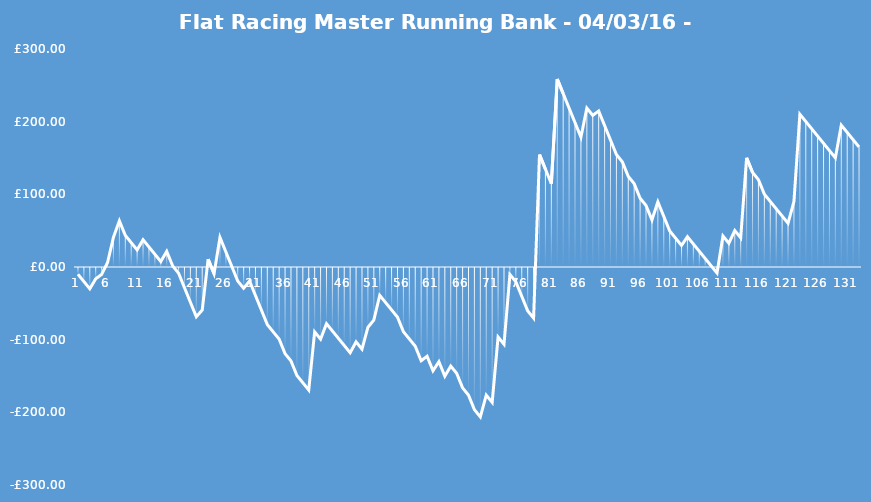
| Category | Running Bank |
|---|---|
| 0 | -10 |
| 1 | -20 |
| 2 | -30 |
| 3 | -16.233 |
| 4 | -10.233 |
| 5 | 6.033 |
| 6 | 41.033 |
| 7 | 63.533 |
| 8 | 43.533 |
| 9 | 33.533 |
| 10 | 23.533 |
| 11 | 37.533 |
| 12 | 27.533 |
| 13 | 17.533 |
| 14 | 7.533 |
| 15 | 21.533 |
| 16 | 1.533 |
| 17 | -8.467 |
| 18 | -28.467 |
| 19 | -48.467 |
| 20 | -68.467 |
| 21 | -59.267 |
| 22 | 10.733 |
| 23 | -9.267 |
| 24 | 40.733 |
| 25 | 20.733 |
| 26 | 0.733 |
| 27 | -19.267 |
| 28 | -29.267 |
| 29 | -19.267 |
| 30 | -39.267 |
| 31 | -59.267 |
| 32 | -79.267 |
| 33 | -89.267 |
| 34 | -99.267 |
| 35 | -119.267 |
| 36 | -129.267 |
| 37 | -149.267 |
| 38 | -159.267 |
| 39 | -169.267 |
| 40 | -89.267 |
| 41 | -99.267 |
| 42 | -78.017 |
| 43 | -88.017 |
| 44 | -98.017 |
| 45 | -108.017 |
| 46 | -118.017 |
| 47 | -103.017 |
| 48 | -113.017 |
| 49 | -83.017 |
| 50 | -73.017 |
| 51 | -39.017 |
| 52 | -49.017 |
| 53 | -59.017 |
| 54 | -69.017 |
| 55 | -89.017 |
| 56 | -99.017 |
| 57 | -109.017 |
| 58 | -129.017 |
| 59 | -122.817 |
| 60 | -142.817 |
| 61 | -130.317 |
| 62 | -150.317 |
| 63 | -136.317 |
| 64 | -146.317 |
| 65 | -166.317 |
| 66 | -176.317 |
| 67 | -196.317 |
| 68 | -206.317 |
| 69 | -176.317 |
| 70 | -186.317 |
| 71 | -96.317 |
| 72 | -106.317 |
| 73 | -10.317 |
| 74 | -20.317 |
| 75 | -40.317 |
| 76 | -60.317 |
| 77 | -70.317 |
| 78 | 154.683 |
| 79 | 134.683 |
| 80 | 114.683 |
| 81 | 258.683 |
| 82 | 238.683 |
| 83 | 218.683 |
| 84 | 198.683 |
| 85 | 178.683 |
| 86 | 218.683 |
| 87 | 208.683 |
| 88 | 214.683 |
| 89 | 194.683 |
| 90 | 174.683 |
| 91 | 154.683 |
| 92 | 144.683 |
| 93 | 124.683 |
| 94 | 114.683 |
| 95 | 94.683 |
| 96 | 84.683 |
| 97 | 64.683 |
| 98 | 89.683 |
| 99 | 69.683 |
| 100 | 49.683 |
| 101 | 39.683 |
| 102 | 29.683 |
| 103 | 41.683 |
| 104 | 31.683 |
| 105 | 21.683 |
| 106 | 11.683 |
| 107 | 1.683 |
| 108 | -8.317 |
| 109 | 42.683 |
| 110 | 32.683 |
| 111 | 50.183 |
| 112 | 40.183 |
| 113 | 150.183 |
| 114 | 130.183 |
| 115 | 120.183 |
| 116 | 100.183 |
| 117 | 90.183 |
| 118 | 80.183 |
| 119 | 70.183 |
| 120 | 60.183 |
| 121 | 90.183 |
| 122 | 210.183 |
| 123 | 200.183 |
| 124 | 190.183 |
| 125 | 180.183 |
| 126 | 170.183 |
| 127 | 160.183 |
| 128 | 150.183 |
| 129 | 195.183 |
| 130 | 185.183 |
| 131 | 175.183 |
| 132 | 165.183 |